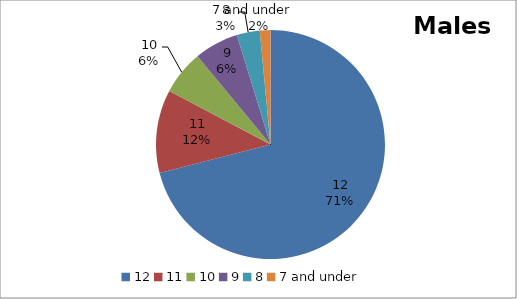
| Category | Series 0 |
|---|---|
| 12 | 284 |
| 11 | 47 |
| 10 | 25 |
| 9 | 25 |
| 8 | 13 |
| 7 and under    | 6 |